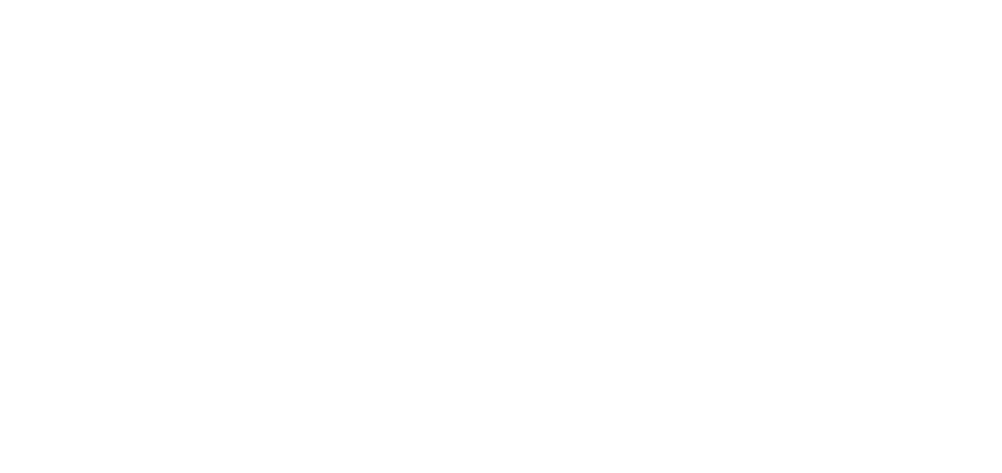
| Category | Total |
|---|---|
| Al Hodeidah | 580 |
| Hajjah | 488 |
| Marib | 203 |
| Taiz | 186 |
| Al Jawf | 163 |
| Amran | 148 |
| Hadramawt | 105 |
| Ad Dali | 95 |
| Lahj | 77 |
| Abyan | 65 |
| Ibb | 56 |
| Sanaa | 51 |
| Al Bayda | 36 |
| Aden | 34 |
| Sadah | 25 |
| Dhamar | 18 |
| Shabwah | 17 |
| Al Maharah | 12 |
| Al Mahwit | 9 |
| Raymah | 8 |
| Sanaa City | 4 |
| Socotra | 1 |